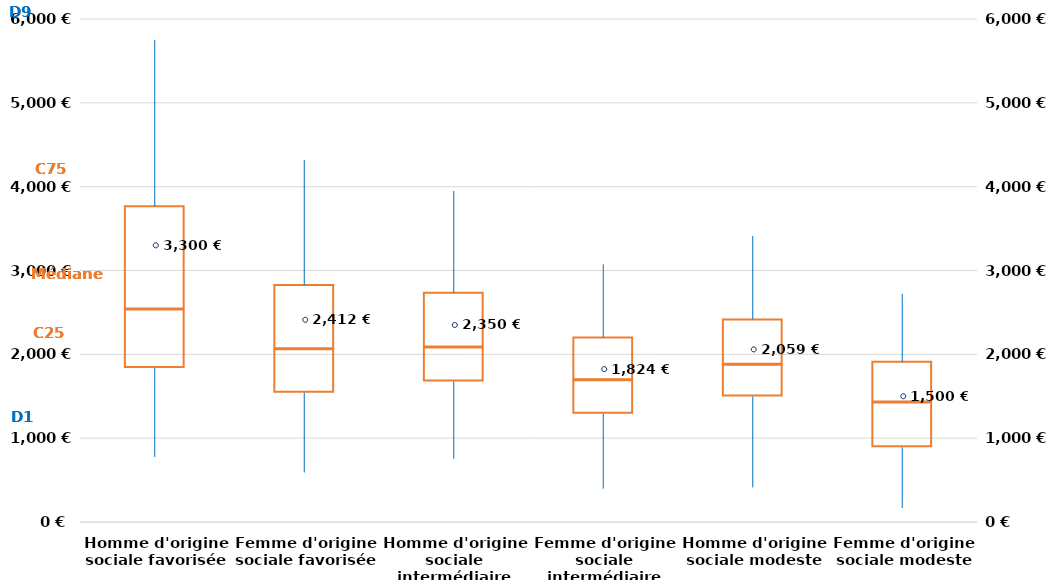
| Category | D1 | C25 | Médiane | C75 | D9 |
|---|---|---|---|---|---|
| Homme d'origine sociale favorisée | 776 | 1060 | 700 | 1231 | 1985 |
| Femme d'origine sociale favorisée | 590 | 952 | 520 | 764 | 1491 |
| Homme d'origine sociale intermédiaire | 755 | 921 | 405 | 654 | 1214 |
| Femme d'origine sociale intermédiaire | 398 | 893 | 400 | 511 | 871 |
| Homme d'origine sociale modeste | 413 | 1083 | 381 | 539 | 996 |
| Femme d'origine sociale modeste | 168 | 724 | 534 | 486 | 811 |